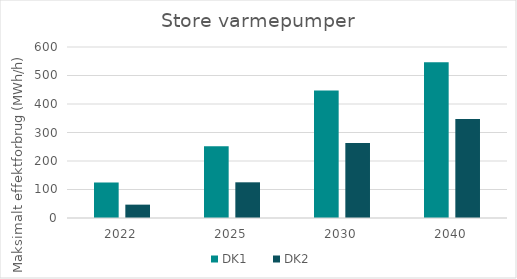
| Category | DK1 | DK2 |
|---|---|---|
| 2022.0 | 124.594 | 46.874 |
| 2025.0 | 252.122 | 125.241 |
| 2030.0 | 447.585 | 263.086 |
| 2040.0 | 546.757 | 347.332 |